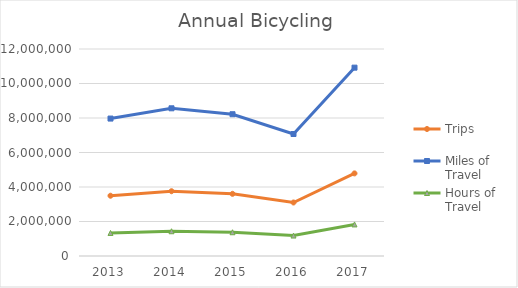
| Category | Trips | Miles of Travel | Hours of Travel |
|---|---|---|---|
| 2013 | 3494097.643 | 7967031.801 | 1335341.043 |
| 2014 | 3754947.196 | 8561805.299 | 1435030.047 |
| 2015 | 3604563.29 | 8218908.94 | 1377557.755 |
| 2016 | 3101475.916 | 7071799.295 | 1185292.601 |
| 2017 | 4788574.157 | 10918619.479 | 1830051.78 |